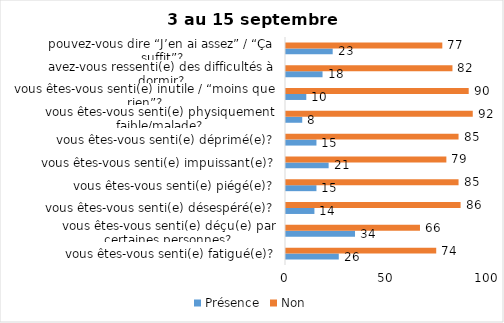
| Category | Présence | Non |
|---|---|---|
| vous êtes-vous senti(e) fatigué(e)? | 26 | 74 |
| vous êtes-vous senti(e) déçu(e) par certaines personnes? | 34 | 66 |
| vous êtes-vous senti(e) désespéré(e)? | 14 | 86 |
| vous êtes-vous senti(e) piégé(e)? | 15 | 85 |
| vous êtes-vous senti(e) impuissant(e)? | 21 | 79 |
| vous êtes-vous senti(e) déprimé(e)? | 15 | 85 |
| vous êtes-vous senti(e) physiquement faible/malade? | 8 | 92 |
| vous êtes-vous senti(e) inutile / “moins que rien”? | 10 | 90 |
| avez-vous ressenti(e) des difficultés à dormir? | 18 | 82 |
| pouvez-vous dire “J’en ai assez” / “Ça suffit”? | 23 | 77 |